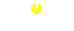
| Category | Eastern Med. |
|---|---|
| 0 | 0 |
| 1 | 20265.4 |
| 2 | 0 |